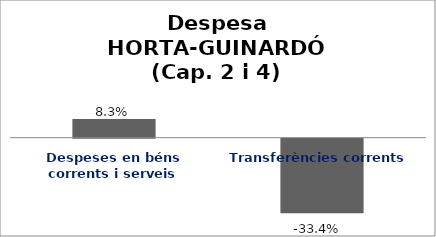
| Category | Series 0 |
|---|---|
| Despeses en béns corrents i serveis | 0.083 |
| Transferències corrents | -0.334 |